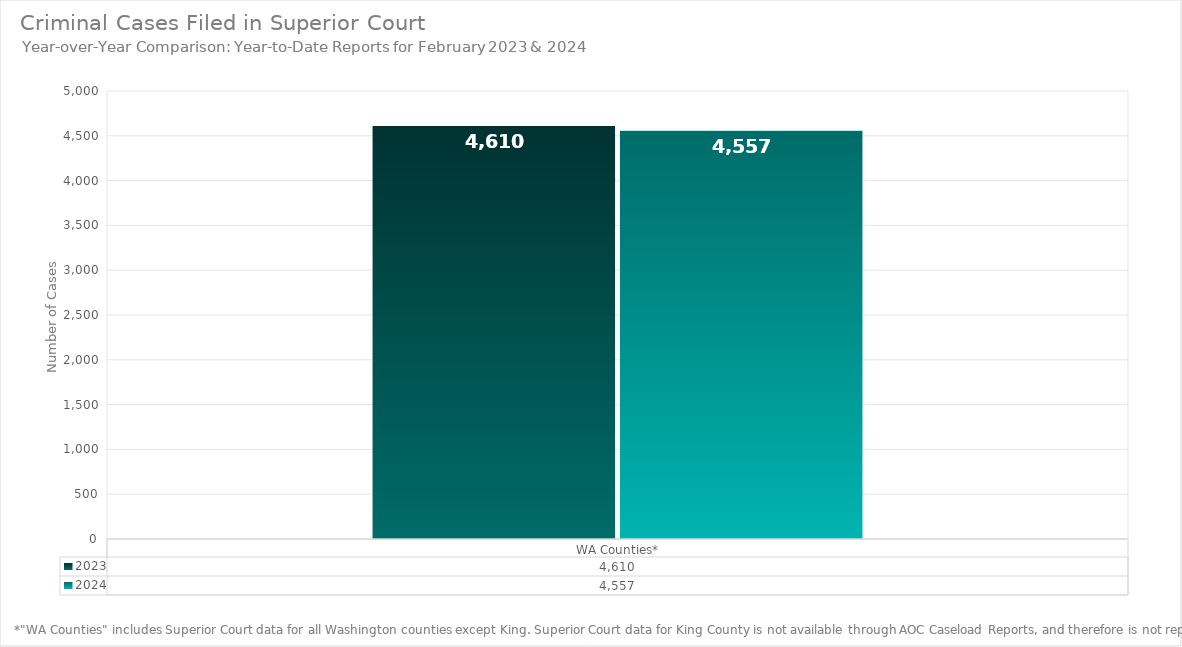
| Category | 2023 | 2024 |
|---|---|---|
|  WA Counties* | 4610 | 4557 |